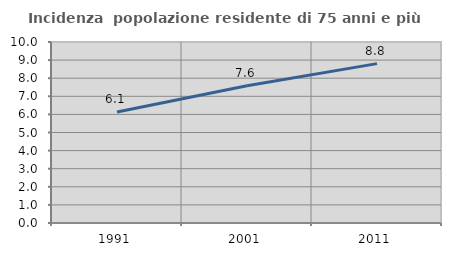
| Category | Incidenza  popolazione residente di 75 anni e più |
|---|---|
| 1991.0 | 6.134 |
| 2001.0 | 7.586 |
| 2011.0 | 8.805 |